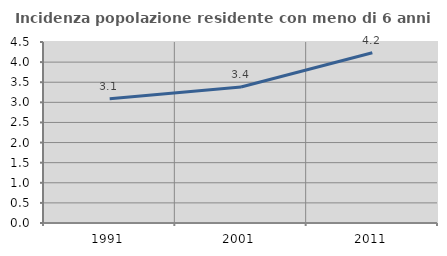
| Category | Incidenza popolazione residente con meno di 6 anni |
|---|---|
| 1991.0 | 3.089 |
| 2001.0 | 3.38 |
| 2011.0 | 4.234 |